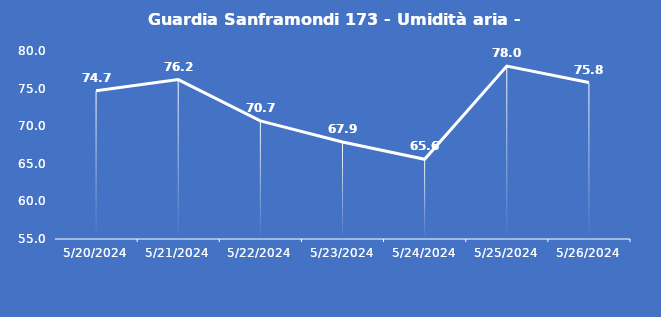
| Category | Guardia Sanframondi 173 - Umidità aria - Grezzo (%) |
|---|---|
| 5/20/24 | 74.7 |
| 5/21/24 | 76.2 |
| 5/22/24 | 70.7 |
| 5/23/24 | 67.9 |
| 5/24/24 | 65.6 |
| 5/25/24 | 78 |
| 5/26/24 | 75.8 |